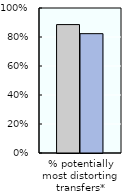
| Category | 2000-02 | 2018-20 |
|---|---|---|
| % potentially most distorting transfers* | 0.886 | 0.823 |